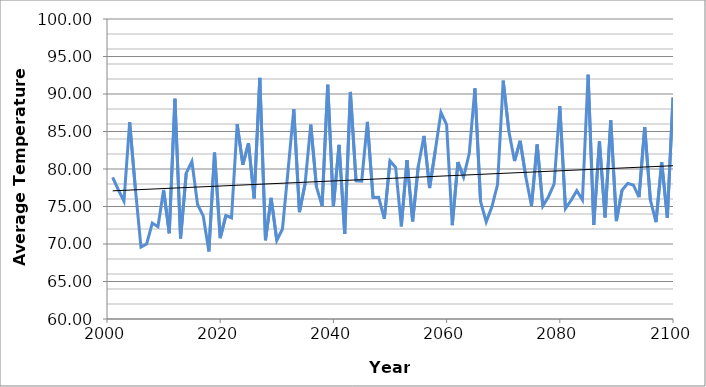
| Category | B1 |
|---|---|
| 2001.0 | 78.877 |
| 2002.0 | 77.236 |
| 2003.0 | 75.722 |
| 2004.0 | 86.247 |
| 2005.0 | 77.482 |
| 2006.0 | 69.588 |
| 2007.0 | 70 |
| 2008.0 | 72.792 |
| 2009.0 | 72.291 |
| 2010.0 | 77.207 |
| 2011.0 | 71.425 |
| 2012.0 | 89.37 |
| 2013.0 | 70.741 |
| 2014.0 | 79.441 |
| 2015.0 | 80.998 |
| 2016.0 | 75.272 |
| 2017.0 | 73.738 |
| 2018.0 | 69.008 |
| 2019.0 | 82.179 |
| 2020.0 | 70.779 |
| 2021.0 | 73.787 |
| 2022.0 | 73.497 |
| 2023.0 | 85.977 |
| 2024.0 | 80.564 |
| 2025.0 | 83.442 |
| 2026.0 | 76.089 |
| 2027.0 | 92.145 |
| 2028.0 | 70.504 |
| 2029.0 | 76.147 |
| 2030.0 | 70.488 |
| 2031.0 | 72.001 |
| 2032.0 | 79.88 |
| 2033.0 | 87.984 |
| 2034.0 | 74.25 |
| 2035.0 | 78.044 |
| 2036.0 | 85.919 |
| 2037.0 | 77.65 |
| 2038.0 | 75.09 |
| 2039.0 | 91.229 |
| 2040.0 | 75.004 |
| 2041.0 | 83.208 |
| 2042.0 | 71.343 |
| 2043.0 | 90.271 |
| 2044.0 | 78.427 |
| 2045.0 | 78.388 |
| 2046.0 | 86.284 |
| 2047.0 | 76.194 |
| 2048.0 | 76.222 |
| 2049.0 | 73.337 |
| 2050.0 | 81.077 |
| 2051.0 | 80.204 |
| 2052.0 | 72.345 |
| 2053.0 | 81.174 |
| 2054.0 | 73.015 |
| 2055.0 | 80.375 |
| 2056.0 | 84.412 |
| 2057.0 | 77.459 |
| 2058.0 | 82.465 |
| 2059.0 | 87.532 |
| 2060.0 | 85.912 |
| 2061.0 | 72.502 |
| 2062.0 | 80.917 |
| 2063.0 | 78.926 |
| 2064.0 | 82.058 |
| 2065.0 | 90.757 |
| 2066.0 | 75.673 |
| 2067.0 | 72.954 |
| 2068.0 | 74.957 |
| 2069.0 | 77.925 |
| 2070.0 | 91.783 |
| 2071.0 | 85.021 |
| 2072.0 | 81.059 |
| 2073.0 | 83.754 |
| 2074.0 | 78.939 |
| 2075.0 | 75.078 |
| 2076.0 | 83.266 |
| 2077.0 | 75.06 |
| 2078.0 | 76.309 |
| 2079.0 | 78.024 |
| 2080.0 | 88.365 |
| 2081.0 | 74.732 |
| 2082.0 | 75.835 |
| 2083.0 | 77.113 |
| 2084.0 | 75.886 |
| 2085.0 | 92.575 |
| 2086.0 | 72.54 |
| 2087.0 | 83.692 |
| 2088.0 | 73.555 |
| 2089.0 | 86.488 |
| 2090.0 | 73.054 |
| 2091.0 | 77.187 |
| 2092.0 | 78.076 |
| 2093.0 | 77.86 |
| 2094.0 | 76.246 |
| 2095.0 | 85.582 |
| 2096.0 | 75.882 |
| 2097.0 | 72.923 |
| 2098.0 | 80.922 |
| 2099.0 | 73.521 |
| 2100.0 | 89.519 |